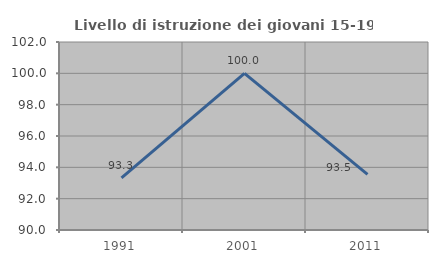
| Category | Livello di istruzione dei giovani 15-19 anni |
|---|---|
| 1991.0 | 93.333 |
| 2001.0 | 100 |
| 2011.0 | 93.548 |